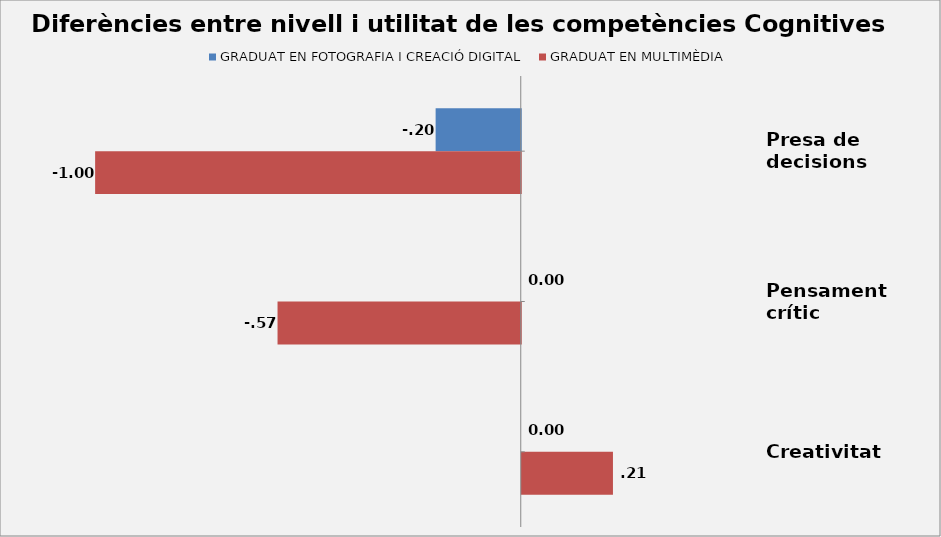
| Category | GRADUAT EN FOTOGRAFIA I CREACIÓ DIGITAL | GRADUAT EN MULTIMÈDIA |
|---|---|---|
| Presa de decisions | -0.2 | -1 |
| Pensament crític | 0 | -0.571 |
| Creativitat | 0 | 0.214 |